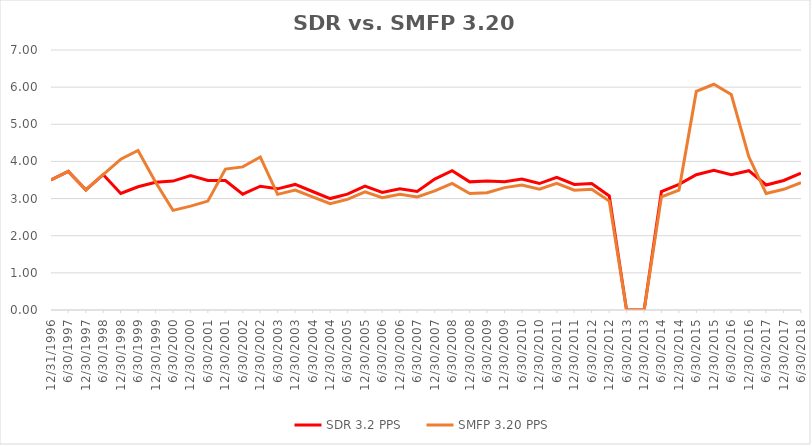
| Category | SDR 3.2 PPS | SMFP 3.20 PPS |
|---|---|---|
| 12/31/96 | 3.5 | 3.5 |
| 6/30/97 | 3.731 | 3.731 |
| 12/31/97 | 3.235 | 3.235 |
| 6/30/98 | 3.647 | 3.647 |
| 12/31/98 | 3.136 | 4.059 |
| 6/30/99 | 3.318 | 4.294 |
| 12/31/99 | 3.441 | 3.441 |
| 6/30/00 | 3.471 | 2.682 |
| 12/31/00 | 3.618 | 2.795 |
| 6/30/01 | 3.486 | 2.932 |
| 12/31/01 | 3.486 | 3.794 |
| 6/30/02 | 3.119 | 3.853 |
| 12/31/02 | 3.333 | 4.118 |
| 6/30/03 | 3.262 | 3.114 |
| 12/31/03 | 3.381 | 3.227 |
| 6/30/04 | 3.19 | 3.045 |
| 12/31/04 | 3 | 2.864 |
| 6/30/05 | 3.119 | 2.977 |
| 12/31/05 | 3.333 | 3.182 |
| 6/30/06 | 3.167 | 3.023 |
| 12/31/06 | 3.262 | 3.114 |
| 6/30/07 | 3.19 | 3.045 |
| 12/31/07 | 3.525 | 3.205 |
| 6/30/08 | 3.75 | 3.409 |
| 12/31/08 | 3.45 | 3.136 |
| 6/30/09 | 3.475 | 3.159 |
| 12/31/09 | 3.452 | 3.295 |
| 6/30/10 | 3.524 | 3.364 |
| 12/31/10 | 3.405 | 3.25 |
| 6/30/11 | 3.571 | 3.409 |
| 12/31/11 | 3.381 | 3.227 |
| 6/30/12 | 3.405 | 3.25 |
| 12/31/12 | 3.071 | 2.932 |
| 6/30/13 | 0 | 0 |
| 12/31/13 | 0 | 0 |
| 6/30/14 | 3.19 | 3.045 |
| 12/31/14 | 3.381 | 3.227 |
| 6/30/15 | 3.643 | 5.885 |
| 12/31/15 | 3.762 | 6.077 |
| 6/30/16 | 3.643 | 5.801 |
| 12/31/16 | 3.75 | 4.124 |
| 6/30/17 | 3.366 | 3.136 |
| 12/31/17 | 3.488 | 3.25 |
| 6/30/18 | 3.683 | 3.432 |